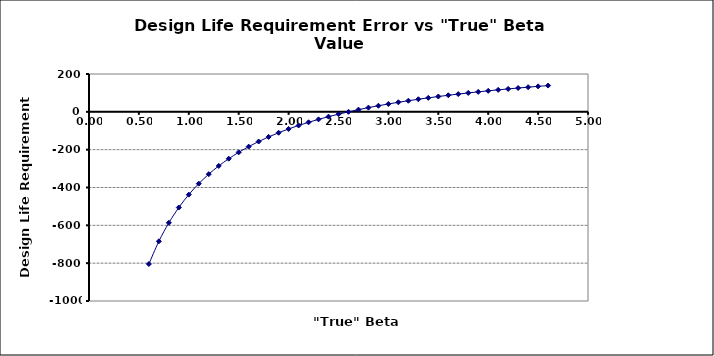
| Category | Series 0 |
|---|---|
| 0.6000000000000001 | -804.428 |
| 0.7000000000000001 | -684.55 |
| 0.8 | -586.817 |
| 0.9 | -505.81 |
| 1.0 | -437.673 |
| 1.1 | -379.62 |
| 1.2000000000000002 | -329.598 |
| 1.3000000000000003 | -286.068 |
| 1.4000000000000004 | -247.854 |
| 1.5000000000000004 | -214.047 |
| 1.6000000000000005 | -183.931 |
| 1.7000000000000006 | -156.937 |
| 1.8000000000000007 | -132.605 |
| 1.9000000000000008 | -110.563 |
| 2.000000000000001 | -90.502 |
| 2.100000000000001 | -72.169 |
| 2.200000000000001 | -55.349 |
| 2.300000000000001 | -39.864 |
| 2.4000000000000012 | -25.561 |
| 2.5000000000000013 | -12.311 |
| 2.6000000000000014 | 0 |
| 2.7000000000000015 | 11.467 |
| 2.8000000000000016 | 22.173 |
| 2.9000000000000017 | 32.192 |
| 3.0000000000000018 | 41.588 |
| 3.100000000000002 | 50.418 |
| 3.200000000000002 | 58.73 |
| 3.300000000000002 | 66.569 |
| 3.400000000000002 | 73.974 |
| 3.500000000000002 | 80.98 |
| 3.6000000000000023 | 87.619 |
| 3.7000000000000024 | 93.918 |
| 3.8000000000000025 | 99.904 |
| 3.9000000000000026 | 105.598 |
| 4.000000000000003 | 111.022 |
| 4.100000000000002 | 116.194 |
| 4.200000000000002 | 121.132 |
| 4.300000000000002 | 125.851 |
| 4.400000000000001 | 130.365 |
| 4.500000000000001 | 134.687 |
| 4.6000000000000005 | 138.83 |